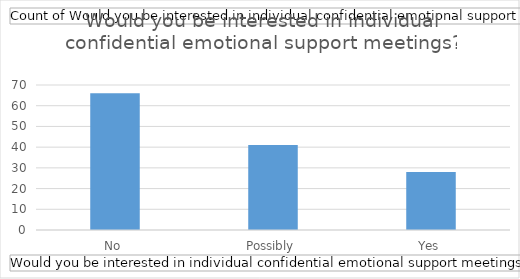
| Category | Total |
|---|---|
| No | 66 |
| Possibly | 41 |
| Yes | 28 |